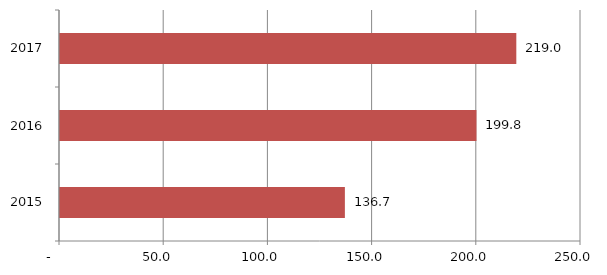
| Category | Series 0 |
|---|---|
| 2015.0 | 136.7 |
| 2016.0 | 199.84 |
| 2017.0 | 218.96 |